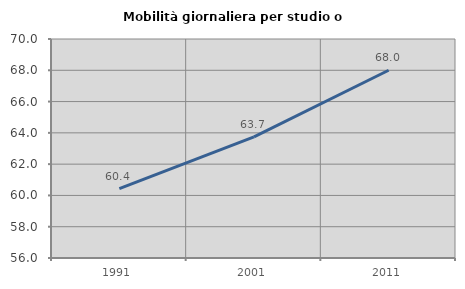
| Category | Mobilità giornaliera per studio o lavoro |
|---|---|
| 1991.0 | 60.441 |
| 2001.0 | 63.74 |
| 2011.0 | 68.003 |